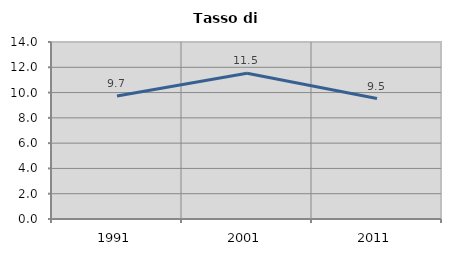
| Category | Tasso di disoccupazione   |
|---|---|
| 1991.0 | 9.722 |
| 2001.0 | 11.523 |
| 2011.0 | 9.524 |